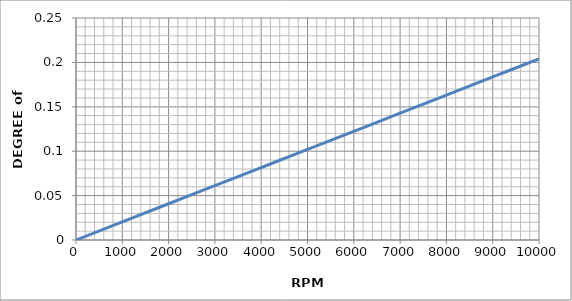
| Category | ERROR |
|---|---|
| 0.0 | 0 |
| 1000.0 | 0.02 |
| 2000.0 | 0.041 |
| 3000.0 | 0.061 |
| 4000.0 | 0.082 |
| 5000.0 | 0.102 |
| 6000.0 | 0.122 |
| 7000.0 | 0.143 |
| 8000.0 | 0.163 |
| 9000.0 | 0.184 |
| 10000.0 | 0.204 |